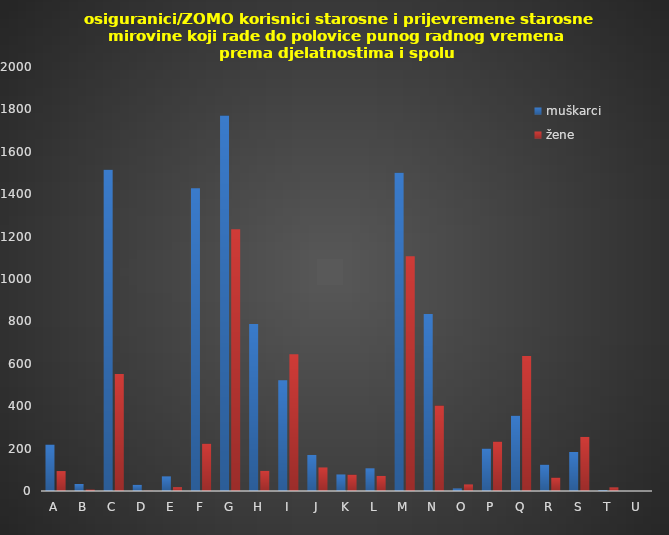
| Category | muškarci | žene |
|---|---|---|
| A | 219 | 94 |
| B | 33 | 7 |
| C | 1515 | 552 |
| D | 29 | 1 |
| E | 69 | 18 |
| F | 1428 | 223 |
| G | 1771 | 1235 |
| H | 788 | 95 |
| I | 522 | 645 |
| J | 170 | 111 |
| K | 78 | 77 |
| L | 107 | 71 |
| M | 1501 | 1107 |
| N | 835 | 403 |
| O | 12 | 31 |
| P | 200 | 233 |
| Q | 355 | 637 |
| R | 124 | 63 |
| S | 184 | 255 |
| T | 4 | 17 |
| U | 0 | 0 |